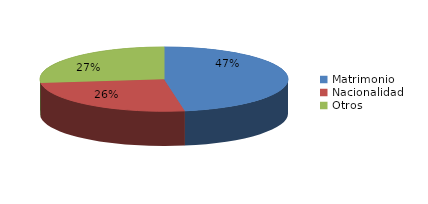
| Category | Series 0 |
|---|---|
| Matrimonio | 338 |
| Nacionalidad | 184 |
| Otros | 192 |